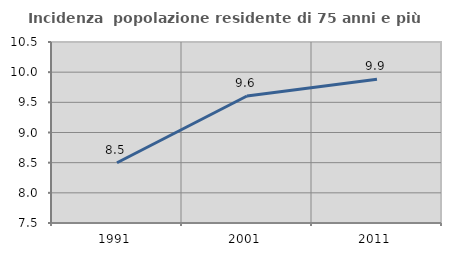
| Category | Incidenza  popolazione residente di 75 anni e più |
|---|---|
| 1991.0 | 8.499 |
| 2001.0 | 9.605 |
| 2011.0 | 9.882 |